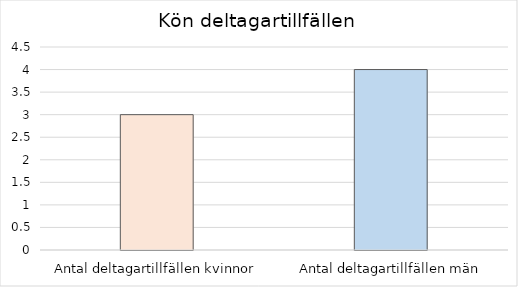
| Category | Series 0 |
|---|---|
| Antal deltagartillfällen kvinnor | 3 |
| Antal deltagartillfällen män | 4 |